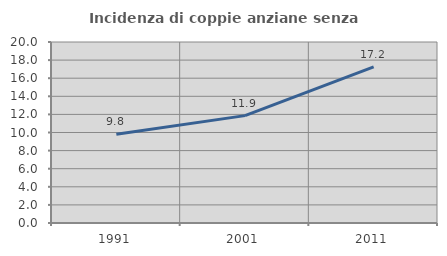
| Category | Incidenza di coppie anziane senza figli  |
|---|---|
| 1991.0 | 9.798 |
| 2001.0 | 11.864 |
| 2011.0 | 17.241 |